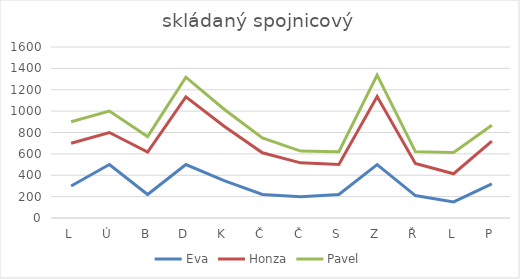
| Category | Eva | Honza | Pavel |
|---|---|---|---|
| L | 300 | 400 | 200 |
| Ú | 500 | 300 | 200 |
| B | 220 | 396 | 146 |
| D | 500 | 634 | 184 |
| K | 350 | 509 | 159 |
| Č | 220 | 390 | 140 |
| Č | 200 | 316 | 110 |
| S | 220 | 280 | 120 |
| Z | 500 | 637 | 200 |
| Ř | 210 | 300 | 111 |
| L | 150 | 264 | 200 |
| P | 320 | 399 | 149 |